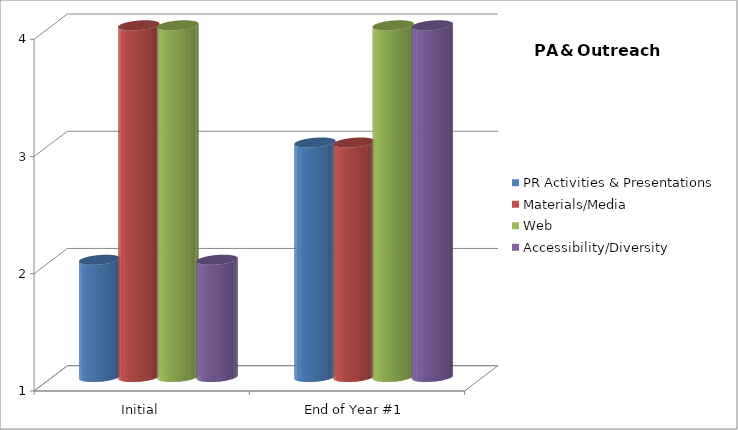
| Category | PR Activities & Presentations  | Materials/Media  | Web | Accessibility/Diversity  |
|---|---|---|---|---|
| Initial | 2 | 4 | 4 | 2 |
| End of Year #1 | 3 | 3 | 4 | 4 |